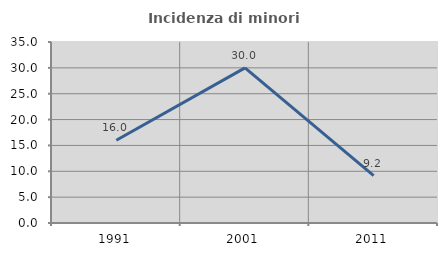
| Category | Incidenza di minori stranieri |
|---|---|
| 1991.0 | 16 |
| 2001.0 | 30 |
| 2011.0 | 9.16 |